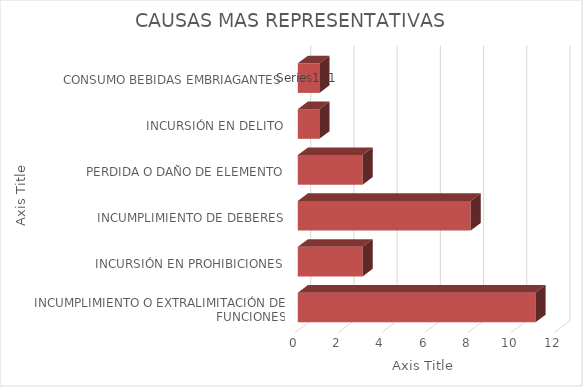
| Category | Series 0 |
|---|---|
| INCUMPLIMIENTO O EXTRALIMITACIÓN DE FUNCIONES | 11 |
| INCURSIÓN EN PROHIBICIONES | 3 |
| INCUMPLIMIENTO DE DEBERES | 8 |
| PERDIDA O DAÑO DE ELEMENTO | 3 |
| INCURSIÓN EN DELITO | 1 |
| CONSUMO BEBIDAS EMBRIAGANTES | 1 |